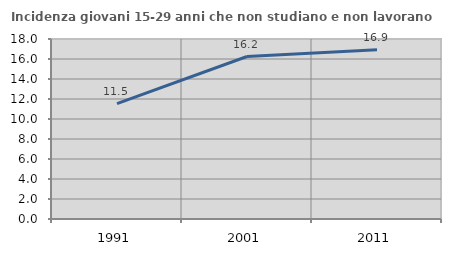
| Category | Incidenza giovani 15-29 anni che non studiano e non lavorano  |
|---|---|
| 1991.0 | 11.538 |
| 2001.0 | 16.249 |
| 2011.0 | 16.924 |